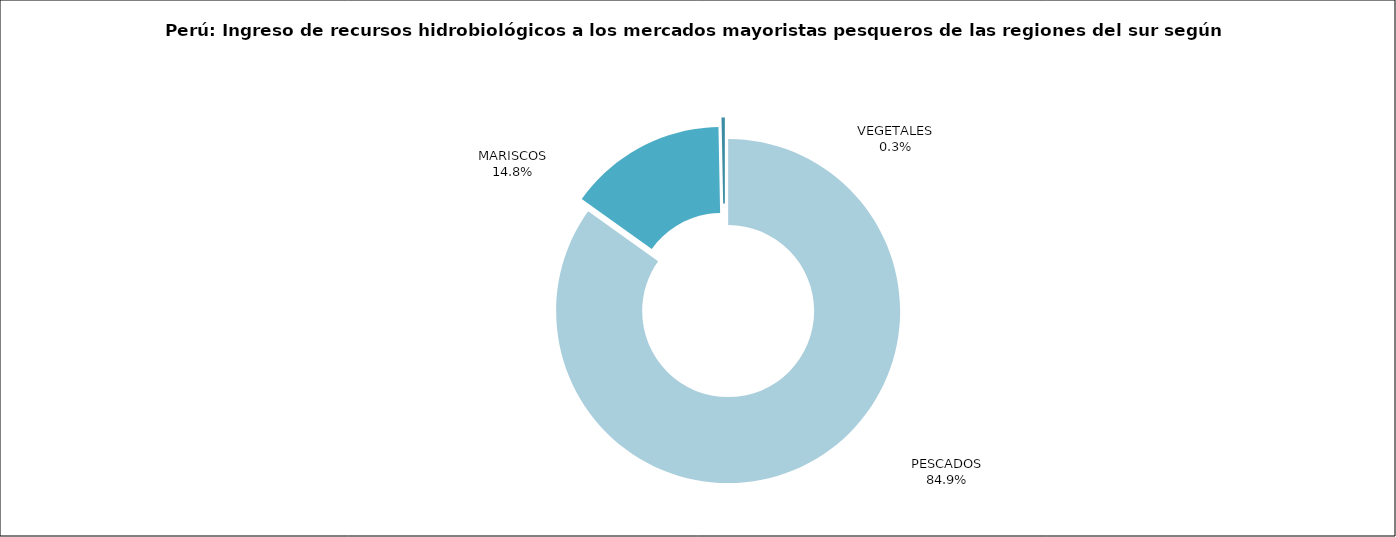
| Category | Series 0 |
|---|---|
| PESCADOS | 17796.237 |
| MARISCOS | 3109.667 |
| VEGETALES | 64.865 |